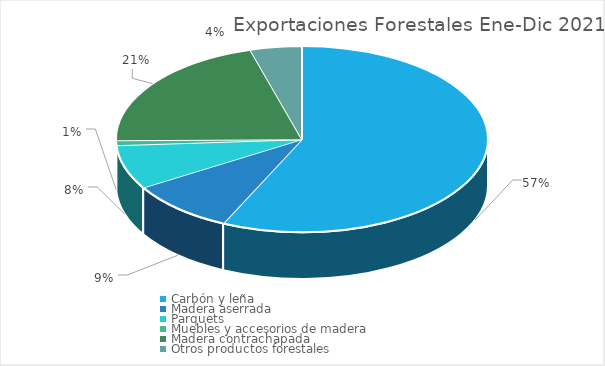
| Category | Ene-Dic 2021 |
|---|---|
| Carbón y leña | 47744950 |
| Madera aserrada | 7805584 |
| Parquets | 6439221 |
| Muebles y accesorios de madera                     | 702218 |
| Madera contrachapada               | 17359589 |
| Otros productos forestales | 3760130 |